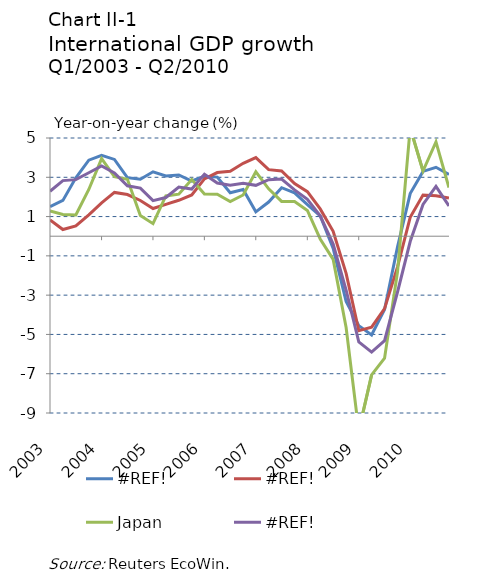
| Category | #REF! | Japan |
|---|---|---|
| 2003-03-31 | 2.29 | 1.29 |
| 2003-06-30 | 2.83 | 1.11 |
| 2003-09-30 | 2.88 | 1.08 |
| 2003-12-31 | 3.23 | 2.38 |
| 2004-03-31 | 3.58 | 3.95 |
| 2004-06-30 | 3.22 | 3.03 |
| 2004-09-30 | 2.57 | 2.9 |
| 2004-12-31 | 2.45 | 1.05 |
| 2005-03-31 | 1.81 | 0.64 |
| 2005-06-30 | 1.97 | 2.05 |
| 2005-09-30 | 2.5 | 2.14 |
| 2005-12-31 | 2.4 | 2.89 |
| 2006-03-31 | 3.16 | 2.15 |
| 2006-06-30 | 2.71 | 2.14 |
| 2006-09-30 | 2.59 | 1.76 |
| 2006-12-31 | 2.7 | 2.1 |
| 2007-03-31 | 2.59 | 3.28 |
| 2007-06-30 | 2.88 | 2.41 |
| 2007-09-30 | 2.91 | 1.77 |
| 2007-12-31 | 2.36 | 1.77 |
| 2008-03-31 | 1.88 | 1.31 |
| 2008-06-30 | 1.04 | -0.14 |
| 2008-09-30 | -0.4 | -1.18 |
| 2008-12-31 | -2.75 | -4.65 |
| 2009-03-31 | -5.38 | -9.91 |
| 2009-06-30 | -5.9 | -7.06 |
| 2009-09-30 | -5.32 | -6.21 |
| 2009-12-31 | -2.84 | -1.81 |
| 2010-03-31 | -0.27 | 5.52 |
| 2010-06-30 | 1.62 | 3.32 |
| 2010-09-30 | 2.54 | 4.8 |
| 2010-12-31 | 1.54 | 2.48 |